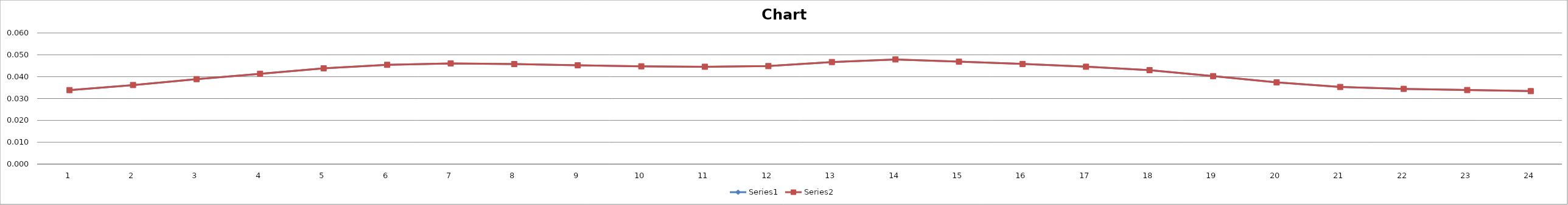
| Category | Series 0 | Series 1 |
|---|---|---|
| 0 | 0.034 | 0.034 |
| 1 | 0.036 | 0.036 |
| 2 | 0.039 | 0.039 |
| 3 | 0.041 | 0.041 |
| 4 | 0.044 | 0.044 |
| 5 | 0.045 | 0.045 |
| 6 | 0.046 | 0.046 |
| 7 | 0.046 | 0.046 |
| 8 | 0.045 | 0.045 |
| 9 | 0.045 | 0.045 |
| 10 | 0.045 | 0.045 |
| 11 | 0.045 | 0.045 |
| 12 | 0.047 | 0.047 |
| 13 | 0.048 | 0.048 |
| 14 | 0.047 | 0.047 |
| 15 | 0.046 | 0.046 |
| 16 | 0.045 | 0.045 |
| 17 | 0.043 | 0.043 |
| 18 | 0.04 | 0.04 |
| 19 | 0.037 | 0.037 |
| 20 | 0.035 | 0.035 |
| 21 | 0.034 | 0.034 |
| 22 | 0.034 | 0.034 |
| 23 | 0.033 | 0.033 |